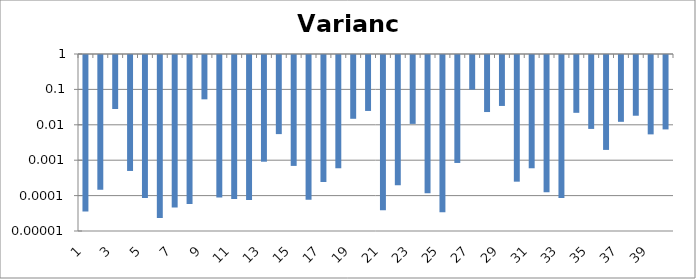
| Category | Variance |
|---|---|
| 1.0 | 0 |
| 2.0 | 0 |
| 3.0 | 0.03 |
| 4.0 | 0.001 |
| 5.0 | 0 |
| 6.0 | 0 |
| 7.0 | 0 |
| 8.0 | 0 |
| 9.0 | 0.056 |
| 10.0 | 0 |
| 11.0 | 0 |
| 12.0 | 0 |
| 13.0 | 0.001 |
| 14.0 | 0.006 |
| 15.0 | 0.001 |
| 16.0 | 0 |
| 17.0 | 0 |
| 18.0 | 0.001 |
| 19.0 | 0.016 |
| 20.0 | 0.026 |
| 21.0 | 0 |
| 22.0 | 0 |
| 23.0 | 0.011 |
| 24.0 | 0 |
| 25.0 | 0 |
| 26.0 | 0.001 |
| 27.0 | 0.105 |
| 28.0 | 0.024 |
| 29.0 | 0.036 |
| 30.0 | 0 |
| 31.0 | 0.001 |
| 32.0 | 0 |
| 33.0 | 0 |
| 34.0 | 0.023 |
| 35.0 | 0.008 |
| 36.0 | 0.002 |
| 37.0 | 0.013 |
| 38.0 | 0.019 |
| 39.0 | 0.006 |
| 40.0 | 0.008 |